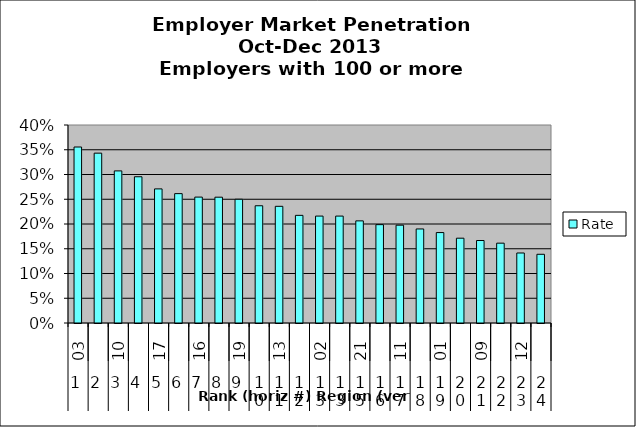
| Category | Rate |
|---|---|
| 0 | 0.356 |
| 1 | 0.343 |
| 2 | 0.307 |
| 3 | 0.295 |
| 4 | 0.271 |
| 5 | 0.261 |
| 6 | 0.254 |
| 7 | 0.254 |
| 8 | 0.25 |
| 9 | 0.237 |
| 10 | 0.236 |
| 11 | 0.217 |
| 12 | 0.216 |
| 13 | 0.216 |
| 14 | 0.206 |
| 15 | 0.199 |
| 16 | 0.198 |
| 17 | 0.19 |
| 18 | 0.183 |
| 19 | 0.171 |
| 20 | 0.167 |
| 21 | 0.161 |
| 22 | 0.141 |
| 23 | 0.139 |